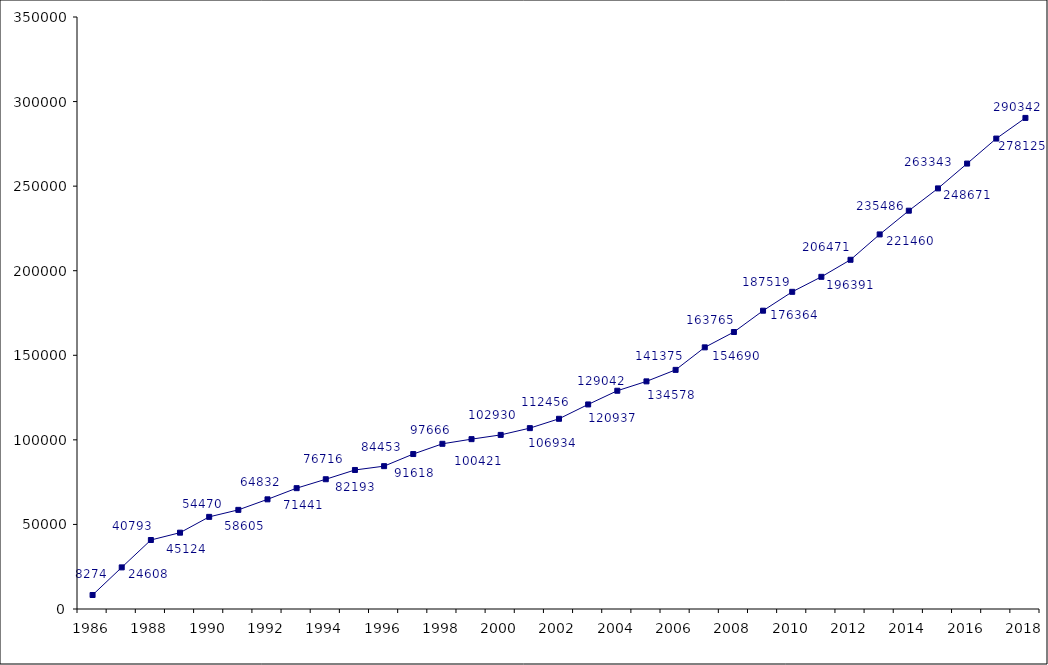
| Category | AB |
|---|---|
| 1986.0 | 8274 |
| 1987.0 | 24608 |
| 1988.0 | 40793 |
| 1989.0 | 45124 |
| 1990.0 | 54470 |
| 1991.0 | 58605 |
| 1992.0 | 64832 |
| 1993.0 | 71441 |
| 1994.0 | 76716 |
| 1995.0 | 82193 |
| 1996.0 | 84453 |
| 1997.0 | 91618 |
| 1998.0 | 97666 |
| 1999.0 | 100421 |
| 2000.0 | 102930 |
| 2001.0 | 106934 |
| 2002.0 | 112456 |
| 2003.0 | 120937 |
| 2004.0 | 129042 |
| 2005.0 | 134578 |
| 2006.0 | 141375 |
| 2007.0 | 154690 |
| 2008.0 | 163765 |
| 2009.0 | 176364 |
| 2010.0 | 187519 |
| 2011.0 | 196391 |
| 2012.0 | 206471 |
| 2013.0 | 221460 |
| 2014.0 | 235486 |
| 2015.0 | 248671 |
| 2016.0 | 263343 |
| 2017.0 | 278125 |
| 2018.0 | 290342 |